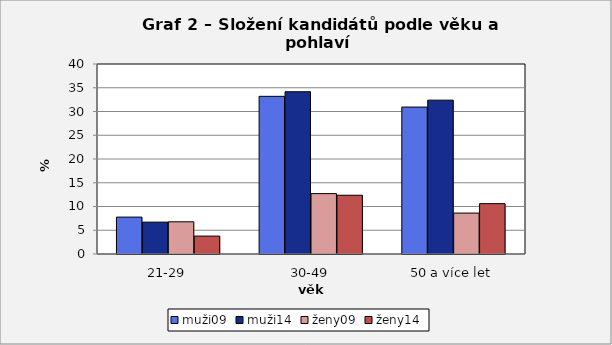
| Category | muži09 | muži14 | ženy09 | ženy14 |
|---|---|---|---|---|
| 21-29 | 7.768 | 6.71 | 6.78 | 3.77 |
| 30-49 | 33.192 | 34.16 | 12.712 | 12.37 |
| 50 a více let | 30.932 | 32.39 | 8.616 | 10.6 |